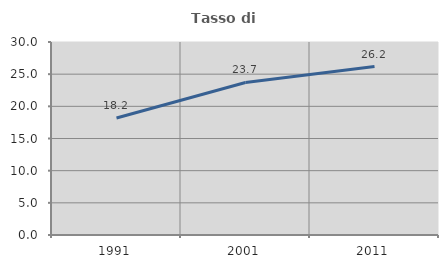
| Category | Tasso di occupazione   |
|---|---|
| 1991.0 | 18.193 |
| 2001.0 | 23.706 |
| 2011.0 | 26.182 |